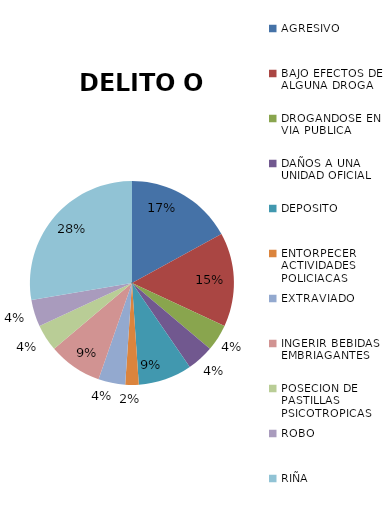
| Category | DELITO O FALTA |
|---|---|
| AGRESIVO | 8 |
| BAJO EFECTOS DE ALGUNA DROGA | 7 |
| DROGANDOSE EN VIA PUBLICA | 2 |
| DAÑOS A UNA UNIDAD OFICIAL  | 2 |
| DEPOSITO | 4 |
| ENTORPECER ACTIVIDADES POLICIACAS | 1 |
| EXTRAVIADO | 2 |
| INGERIR BEBIDAS EMBRIAGANTES | 4 |
| POSECION DE PASTILLAS PSICOTROPICAS | 2 |
| ROBO | 2 |
| RIÑA | 13 |